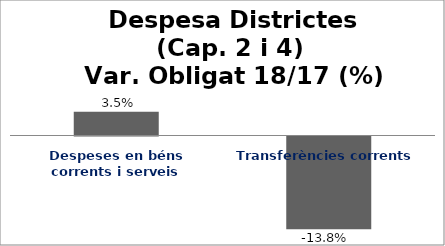
| Category | Series 0 |
|---|---|
| Despeses en béns corrents i serveis | 0.035 |
| Transferències corrents | -0.138 |